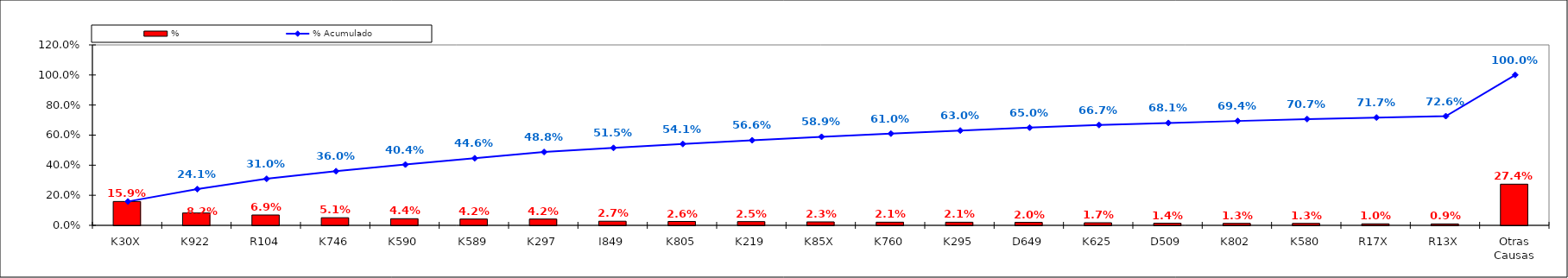
| Category | % |
|---|---|
| K30X | 0.159 |
| K922 | 0.082 |
| R104 | 0.069 |
| K746 | 0.051 |
| K590 | 0.044 |
| K589 | 0.042 |
| K297 | 0.042 |
| I849 | 0.027 |
| K805 | 0.026 |
| K219 | 0.025 |
| K85X | 0.023 |
| K760 | 0.021 |
| K295 | 0.021 |
| D649 | 0.02 |
| K625 | 0.017 |
| D509 | 0.014 |
| K802 | 0.013 |
| K580 | 0.013 |
| R17X | 0.01 |
| R13X | 0.009 |
| Otras Causas | 0.274 |